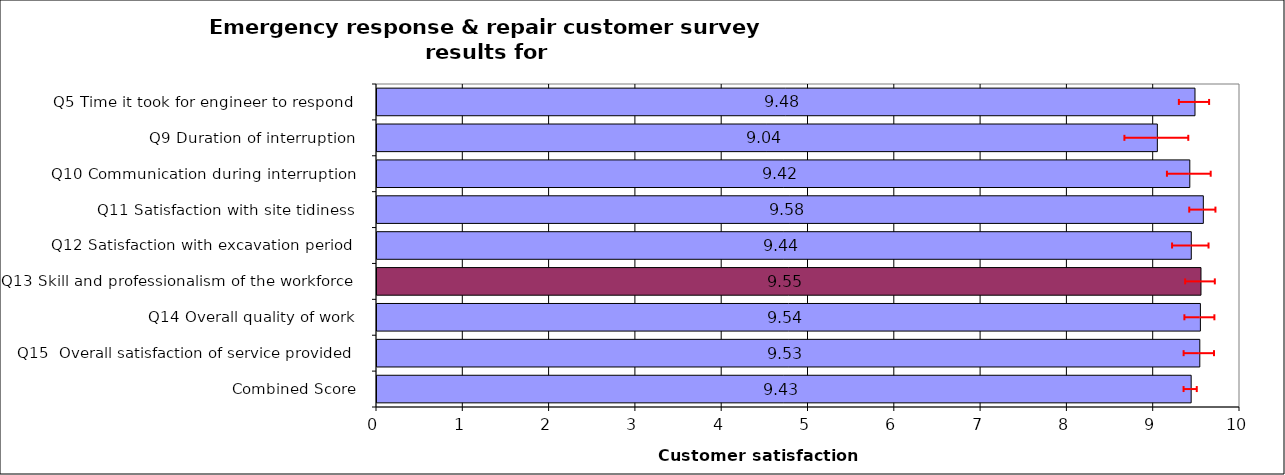
| Category | Series 0 |
|---|---|
| Q5 Time it took for engineer to respond | 9.478 |
| Q9 Duration of interruption | 9.042 |
| Q10 Communication during interruption | 9.418 |
| Q11 Satisfaction with site tidiness | 9.575 |
| Q12 Satisfaction with excavation period | 9.436 |
| Q13 Skill and professionalism of the workforce | 9.548 |
| Q14 Overall quality of work | 9.541 |
| Q15  Overall satisfaction of service provided | 9.534 |
| Combined Score | 9.434 |